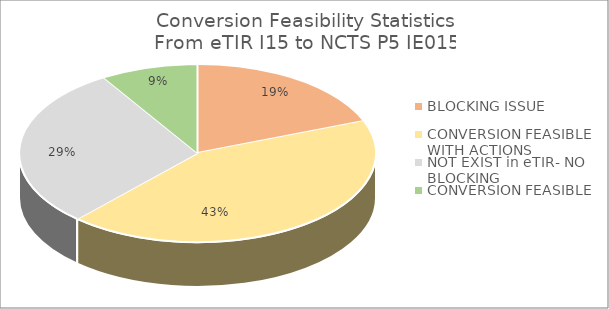
| Category | Total |
|---|---|
| BLOCKING ISSUE | 13 |
| CONVERSION FEASIBLE WITH ACTIONS  | 29 |
| NOT EXIST in eTIR- NO BLOCKING | 20 |
| COΝVERSION FEASIBLE | 6 |